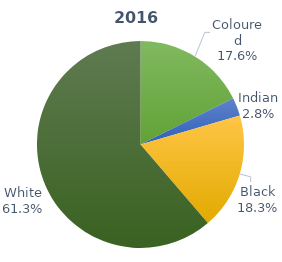
| Category | Series 0 |
|---|---|
| Coloured | 5443 |
| Indian | 875 |
| Black | 5629 |
| White | 18907 |